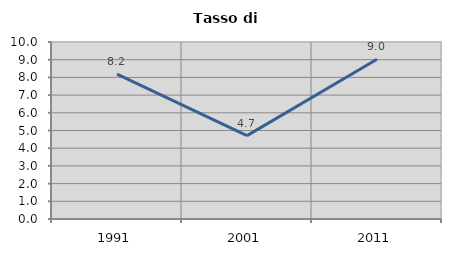
| Category | Tasso di disoccupazione   |
|---|---|
| 1991.0 | 8.18 |
| 2001.0 | 4.712 |
| 2011.0 | 9.026 |